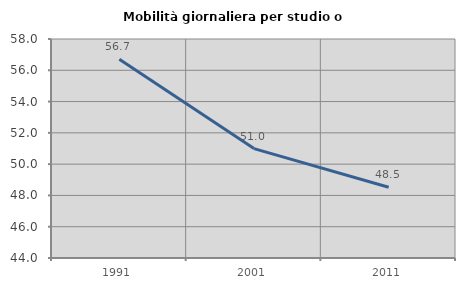
| Category | Mobilità giornaliera per studio o lavoro |
|---|---|
| 1991.0 | 56.709 |
| 2001.0 | 50.993 |
| 2011.0 | 48.525 |